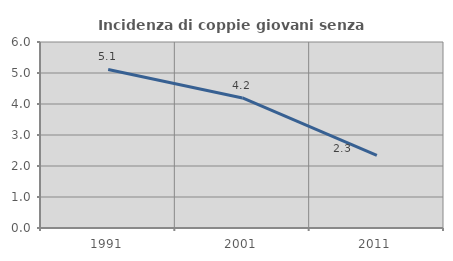
| Category | Incidenza di coppie giovani senza figli |
|---|---|
| 1991.0 | 5.114 |
| 2001.0 | 4.194 |
| 2011.0 | 2.339 |